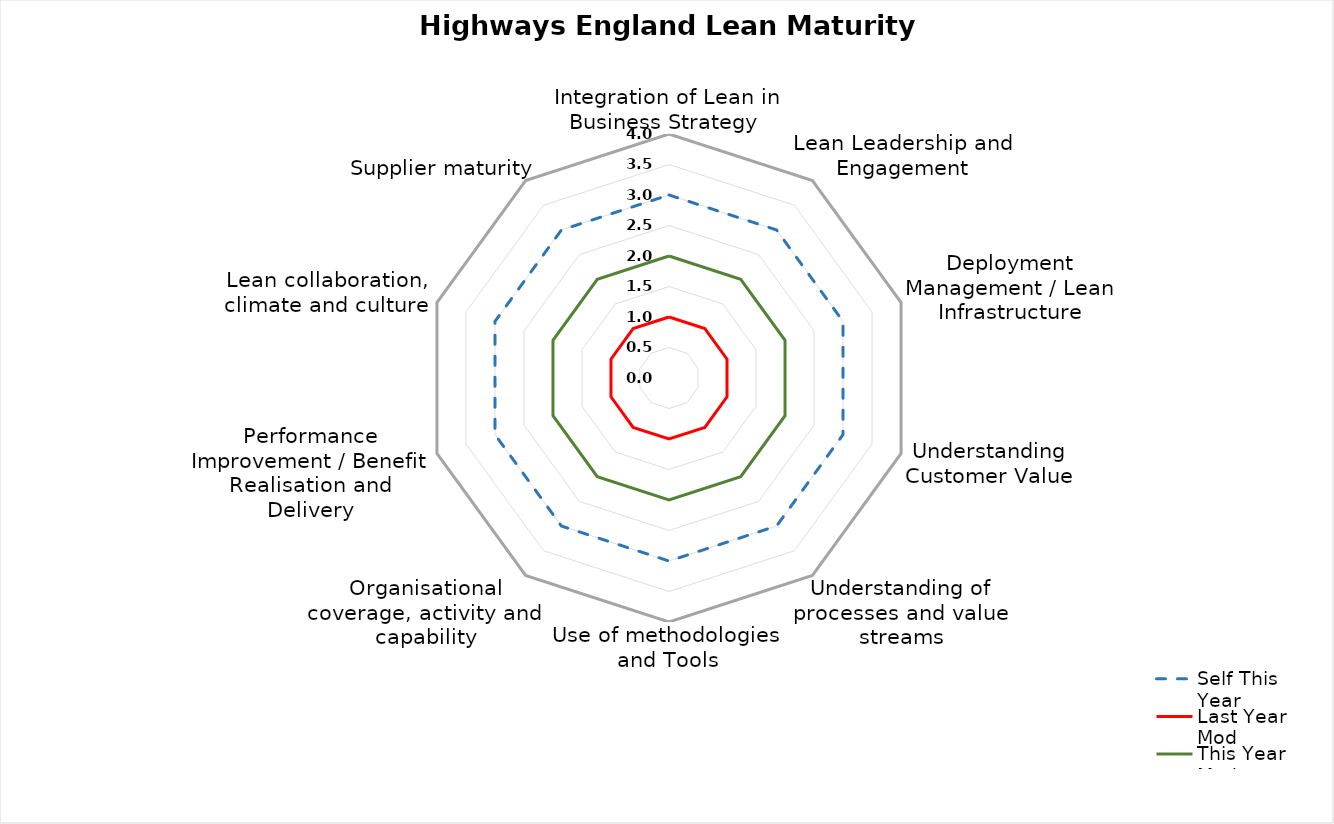
| Category | Self This Year | Last Year Mod | Max | This Year Mod |
|---|---|---|---|---|
| Integration of Lean in Business Strategy  | 3 | 1 | 4 | 2 |
| Lean Leadership and Engagement | 3 | 1 | 4 | 2 |
| Deployment Management / Lean Infrastructure | 3 | 1 | 4 | 2 |
| Understanding Customer Value | 3 | 1 | 4 | 2 |
| Understanding of processes and value streams
 | 3 | 1 | 4 | 2 |
| Use of methodologies and Tools | 3 | 1 | 4 | 2 |
| Organisational coverage, activity and capability | 3 | 1 | 4 | 2 |
| Performance Improvement / Benefit Realisation and Delivery | 3 | 1 | 4 | 2 |
| Lean collaboration, climate and culture | 3 | 1 | 4 | 2 |
| Supplier maturity | 3 | 1 | 4 | 2 |